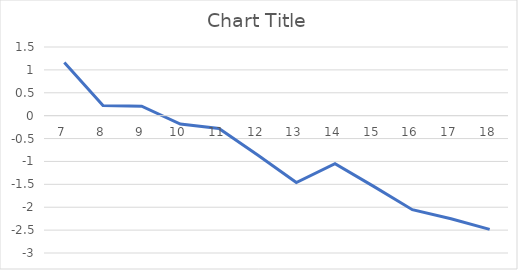
| Category | Series 0 |
|---|---|
| 7 | 1.163 |
| 8 | 0.223 |
| 9 | 0.208 |
| 10 | -0.182 |
| 11 | -0.279 |
| 12 | -0.859 |
| 13 | -1.46 |
| 14 | -1.05 |
| 15 | -1.545 |
| 16 | -2.054 |
| 17 | -2.251 |
| 18 | -2.485 |